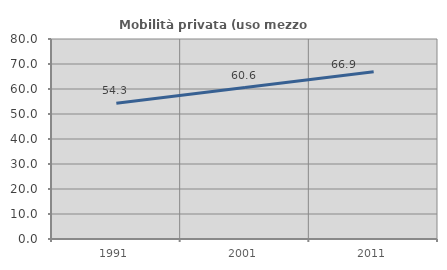
| Category | Mobilità privata (uso mezzo privato) |
|---|---|
| 1991.0 | 54.284 |
| 2001.0 | 60.572 |
| 2011.0 | 66.891 |